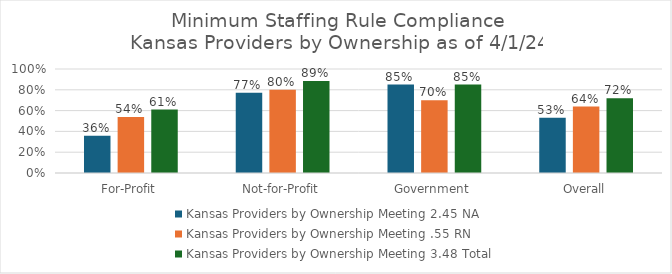
| Category | Kansas Providers by Ownership |
|---|---|
| For-Profit | 0.61 |
| Not-for-Profit | 0.886 |
| Government | 0.85 |
| Overall | 0.72 |